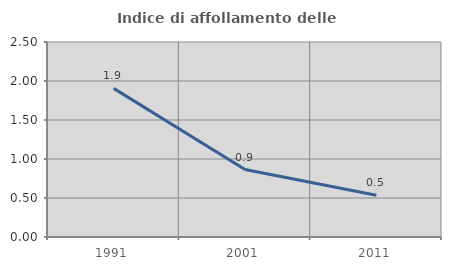
| Category | Indice di affollamento delle abitazioni  |
|---|---|
| 1991.0 | 1.906 |
| 2001.0 | 0.864 |
| 2011.0 | 0.534 |